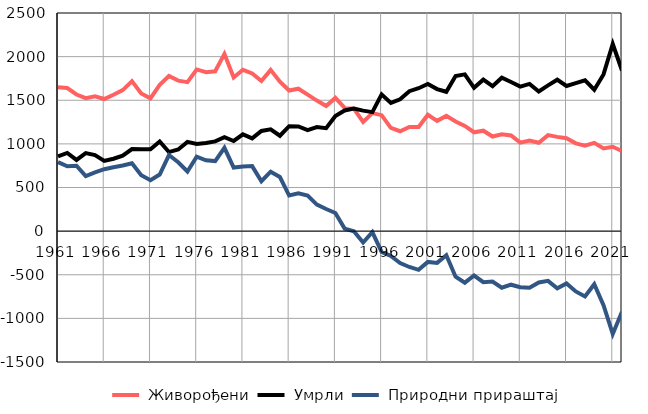
| Category |  Живорођени |  Умрли |  Природни прираштај |
|---|---|---|---|
| 1961.0 | 1648 | 857 | 791 |
| 1962.0 | 1640 | 896 | 744 |
| 1963.0 | 1566 | 816 | 750 |
| 1964.0 | 1524 | 894 | 630 |
| 1965.0 | 1546 | 872 | 674 |
| 1966.0 | 1514 | 804 | 710 |
| 1967.0 | 1563 | 830 | 733 |
| 1968.0 | 1616 | 864 | 752 |
| 1969.0 | 1719 | 941 | 778 |
| 1970.0 | 1578 | 937 | 641 |
| 1971.0 | 1522 | 938 | 584 |
| 1972.0 | 1677 | 1028 | 649 |
| 1973.0 | 1778 | 906 | 872 |
| 1974.0 | 1725 | 936 | 789 |
| 1975.0 | 1707 | 1023 | 684 |
| 1976.0 | 1853 | 999 | 854 |
| 1977.0 | 1821 | 1009 | 812 |
| 1978.0 | 1832 | 1029 | 803 |
| 1979.0 | 2031 | 1076 | 955 |
| 1980.0 | 1761 | 1033 | 728 |
| 1981.0 | 1849 | 1109 | 740 |
| 1982.0 | 1808 | 1063 | 745 |
| 1983.0 | 1720 | 1148 | 572 |
| 1984.0 | 1848 | 1167 | 681 |
| 1985.0 | 1713 | 1093 | 620 |
| 1986.0 | 1611 | 1203 | 408 |
| 1987.0 | 1632 | 1199 | 433 |
| 1988.0 | 1565 | 1157 | 408 |
| 1989.0 | 1496 | 1192 | 304 |
| 1990.0 | 1434 | 1180 | 254 |
| 1991.0 | 1527 | 1319 | 208 |
| 1992.0 | 1412 | 1383 | 29 |
| 1993.0 | 1404 | 1406 | -2 |
| 1994.0 | 1251 | 1381 | -130 |
| 1995.0 | 1352 | 1364 | -12 |
| 1996.0 | 1329 | 1567 | -238 |
| 1997.0 | 1184 | 1469 | -285 |
| 1998.0 | 1145 | 1511 | -366 |
| 1999.0 | 1193 | 1604 | -411 |
| 2000.0 | 1194 | 1638 | -444 |
| 2001.0 | 1334 | 1687 | -353 |
| 2002.0 | 1264 | 1628 | -364 |
| 2003.0 | 1321 | 1597 | -276 |
| 2004.0 | 1256 | 1778 | -522 |
| 2005.0 | 1206 | 1797 | -591 |
| 2006.0 | 1133 | 1642 | -509 |
| 2007.0 | 1151 | 1736 | -585 |
| 2008.0 | 1084 | 1662 | -578 |
| 2009.0 | 1110 | 1759 | -649 |
| 2010.0 | 1096 | 1710 | -614 |
| 2011.0 | 1014 | 1657 | -643 |
| 2012.0 | 1039 | 1688 | -649 |
| 2013.0 | 1013 | 1601 | -588 |
| 2014.0 | 1100 | 1670 | -570 |
| 2015.0 | 1080 | 1735 | -655 |
| 2016.0 | 1065 | 1664 | -599 |
| 2017.0 | 1006 | 1697 | -691 |
| 2018.0 | 979 | 1728 | -749 |
| 2019.0 | 1012 | 1621 | -609 |
| 2020.0 | 947 | 1796 | -849 |
| 2021.0 | 967 | 2145 | -1178 |
| 2022.0 | 917 | 1841 | -924 |